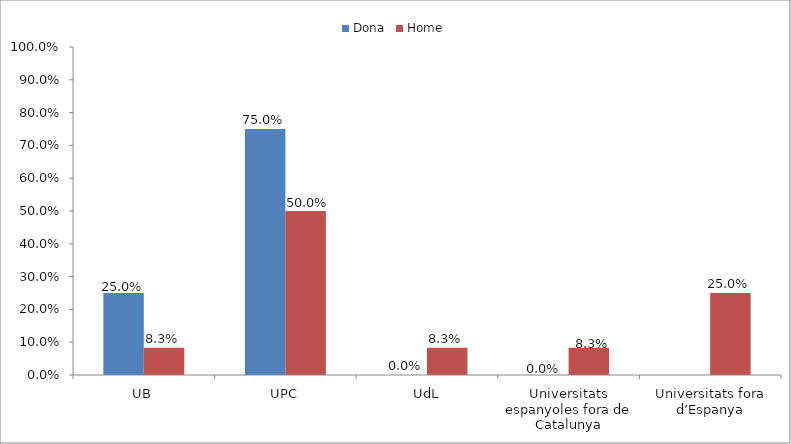
| Category | Dona | Home |
|---|---|---|
| UB | 0.25 | 0.083 |
| UPC | 0.75 | 0.5 |
| UdL | 0 | 0.083 |
| Universitats espanyoles fora de Catalunya | 0 | 0.083 |
| Universitats fora d’Espanya | 0 | 0.25 |